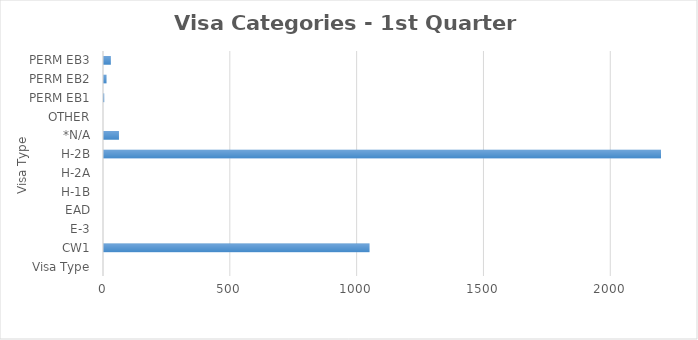
| Category | Series 0 |
|---|---|
| Visa Type | 0 |
| CW1 | 1047 |
| E-3 | 0 |
| EAD | 0 |
| H-1B | 0 |
| H-2A | 0 |
| H-2B | 3719 |
| *N/A | 59 |
| OTHER | 0 |
| PERM EB1 | 1 |
| PERM EB2 | 10 |
| PERM EB3 | 27 |